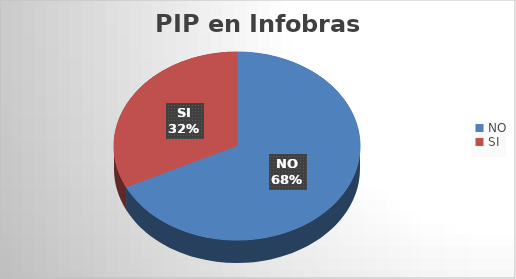
| Category | N° | Costo Total |
|---|---|---|
| NO | 423 | 3311557649.78 |
| SI | 201 | 201190639.21 |